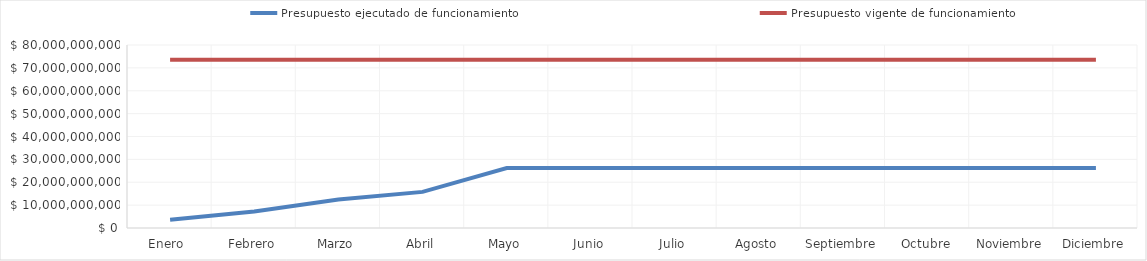
| Category | Presupuesto ejecutado de funcionamiento | Presupuesto vigente de funcionamiento |
|---|---|---|
| Enero  | 3604828283 | 73548486000 |
| Febrero | 7198365243 | 73548486000 |
| Marzo | 12462015939 | 73548486000 |
| Abril | 15781894914 | 73548486000 |
| Mayo | 26182460102 | 73548486000 |
| Junio | 26182460102 | 73548486000 |
| Julio | 26182460102 | 73548486000 |
| Agosto | 26182460102 | 73548486000 |
| Septiembre | 26182460102 | 73548486000 |
| Octubre | 26182460102 | 73548486000 |
| Noviembre | 26182460102 | 73548486000 |
| Diciembre | 26182460102 | 73548486000 |